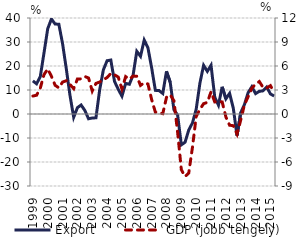
| Category | Export |
|---|---|
| 1999.0 | 13.81 |
| nan | 12.588 |
| nan | 15.563 |
| nan | 25.432 |
| 2000.0 | 35.508 |
| nan | 39.598 |
| nan | 37.486 |
| nan | 37.402 |
| 2001.0 | 29.355 |
| nan | 18.908 |
| nan | 7.788 |
| nan | -1.359 |
| 2002.0 | 2.614 |
| nan | 3.768 |
| nan | 1.477 |
| nan | -1.985 |
| 2003.0 | -1.663 |
| nan | -1.588 |
| nan | 10.083 |
| nan | 18.431 |
| 2004.0 | 22.207 |
| nan | 22.487 |
| nan | 13.574 |
| nan | 10.303 |
| 2005.0 | 7.421 |
| nan | 12.754 |
| nan | 12.399 |
| nan | 16.177 |
| 2006.0 | 26.112 |
| nan | 24.041 |
| nan | 30.821 |
| nan | 27.577 |
| 2007.0 | 19.248 |
| nan | 9.848 |
| nan | 9.763 |
| nan | 8.556 |
| 2008.0 | 17.775 |
| nan | 13.249 |
| nan | 1.817 |
| nan | -0.454 |
| 2009.0 | -12.861 |
| nan | -11.775 |
| nan | -6.648 |
| nan | -3.706 |
| 2010.0 | 1.98 |
| nan | 12.832 |
| nan | 20.283 |
| nan | 17.767 |
| 2011.0 | 20.295 |
| nan | 7.022 |
| nan | 3.674 |
| nan | 11.326 |
| 2012.0 | 6.321 |
| nan | 8.594 |
| nan | 2.397 |
| nan | -9.013 |
| 2013.0 | 0.539 |
| nan | 3.955 |
| nan | 8.924 |
| nan | 11.373 |
| 2014.0 | 8.488 |
| nan | 9.45 |
| nan | 9.646 |
| nan | 11.207 |
| 2015.0 | 8.362 |
| nan | 7.487 |